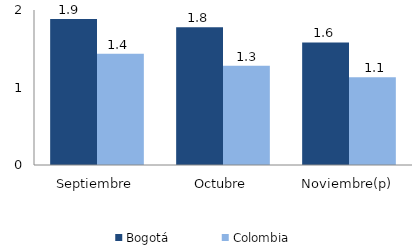
| Category | Bogotá | Colombia |
|---|---|---|
| Septiembre | 1.882 | 1.435 |
| Octubre | 1.778 | 1.281 |
| Noviembre(p) | 1.581 | 1.131 |